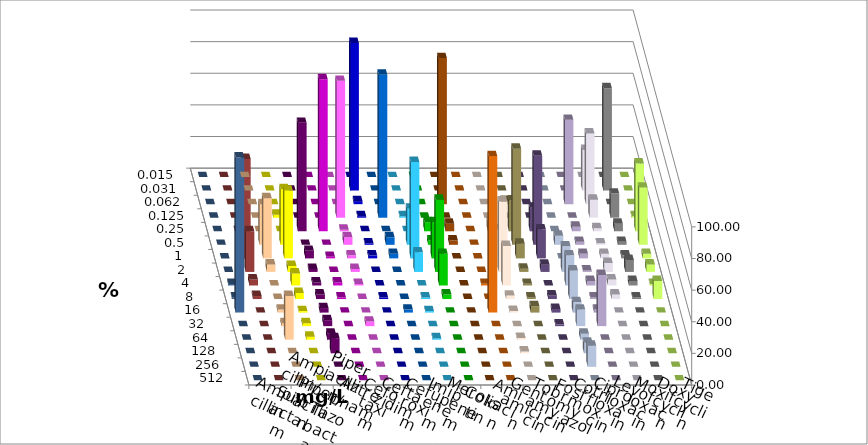
| Category | Ampicillin | Ampicillin/ Sulbactam | Piperacillin | Piperacillin/ Tazobactam | Aztreonam | Cefotaxim | Ceftazidim | Cefuroxim | Imipenem | Meropenem | Colistin | Amikacin | Gentamicin | Tobramycin | Fosfomycin | Cotrimoxazol | Ciprofloxacin | Levofloxacin | Moxifloxacin | Doxycyclin | Tigecyclin |
|---|---|---|---|---|---|---|---|---|---|---|---|---|---|---|---|---|---|---|---|---|---|
| 0.015 | 0 | 0 | 0 | 0 | 0 | 0 | 0 | 0 | 0 | 0 | 0 | 0 | 0 | 0 | 0 | 0 | 0 | 0 | 0 | 0 | 0 |
| 0.031 | 0 | 0 | 0 | 0 | 0 | 93.333 | 0 | 0 | 0 | 0 | 0 | 0 | 0 | 0 | 0 | 0 | 25.714 | 64.762 | 0 | 0 | 0 |
| 0.062 | 0 | 0 | 0 | 0 | 0 | 1.905 | 0 | 0 | 0 | 92.381 | 0 | 0 | 2.062 | 0 | 0 | 53.333 | 44.762 | 0 | 0 | 0 | 0 |
| 0.125 | 0 | 1.905 | 0 | 0 | 86.538 | 0.952 | 90.476 | 0.952 | 0 | 0 | 0 | 0 | 0 | 0 | 0 | 0 | 11.429 | 15.238 | 0.952 | 0 | 0 |
| 0.25 | 0 | 0 | 68.571 | 96.19 | 0.962 | 0 | 0 | 0 | 5.714 | 4.762 | 0 | 6.522 | 19.588 | 14.943 | 0 | 2.857 | 1.905 | 4.762 | 42.857 | 0 | 0 |
| 0.5 | 25.714 | 35.238 | 0 | 0 | 4.808 | 0.952 | 4.762 | 22.857 | 2.857 | 2.857 | 0 | 0 | 60.825 | 56.322 | 5.714 | 1.905 | 0.952 | 1.905 | 36.19 | 0 | 5.714 |
| 1.0 | 38.095 | 42.857 | 4.762 | 0.952 | 1.923 | 1.905 | 2.857 | 60.952 | 22.857 | 0 | 0 | 18.478 | 9.278 | 18.391 | 0 | 2.857 | 2.857 | 1.905 | 2.857 | 0 | 62.857 |
| 2.0 | 4.762 | 3.81 | 1.905 | 0 | 1.923 | 0 | 0 | 12.381 | 45.714 | 0 | 0 | 44.565 | 2.062 | 4.598 | 16.19 | 0.952 | 5.714 | 7.619 | 4.762 | 0 | 25.714 |
| 4.0 | 0 | 7.619 | 1.905 | 1.905 | 0.962 | 0 | 0 | 0 | 20 | 0 | 1.031 | 25 | 1.031 | 0 | 19.048 | 2.857 | 3.81 | 2.857 | 0.952 | 0.952 | 3.81 |
| 8.0 | 0 | 3.81 | 2.857 | 0.952 | 0 | 0.952 | 0 | 0.952 | 2.857 | 0 | 0 | 2.174 | 1.031 | 2.299 | 18.095 | 0.952 | 2.857 | 0.952 | 11.429 | 0.952 | 1.905 |
| 16.0 | 1.905 | 0.952 | 2.857 | 0 | 0 | 0 | 1.905 | 0.952 | 0 | 0 | 98.969 | 1.087 | 4.124 | 2.299 | 6.667 | 1.905 | 0 | 0 | 0 | 98.095 | 0 |
| 32.0 | 1.905 | 1.905 | 3.81 | 0 | 2.885 | 0 | 0 | 0 | 0 | 0 | 0 | 0 | 0 | 1.149 | 10.476 | 32.381 | 0 | 0 | 0 | 0 | 0 |
| 64.0 | 27.619 | 1.905 | 3.81 | 0 | 0 | 0 | 0 | 0.952 | 0 | 0 | 0 | 1.087 | 0 | 0 | 3.81 | 0 | 0 | 0 | 0 | 0 | 0 |
| 128.0 | 0 | 0 | 9.524 | 0 | 0 | 0 | 0 | 0 | 0 | 0 | 0 | 1.087 | 0 | 0 | 6.667 | 0 | 0 | 0 | 0 | 0 | 0 |
| 256.0 | 0 | 0 | 0 | 0 | 0 | 0 | 0 | 0 | 0 | 0 | 0 | 0 | 0 | 0 | 13.333 | 0 | 0 | 0 | 0 | 0 | 0 |
| 512.0 | 0 | 0 | 0 | 0 | 0 | 0 | 0 | 0 | 0 | 0 | 0 | 0 | 0 | 0 | 0 | 0 | 0 | 0 | 0 | 0 | 0 |